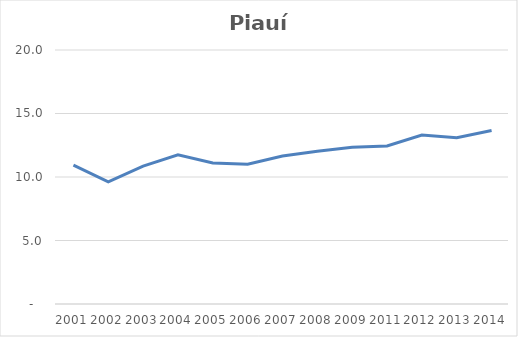
| Category | Total |
|---|---|
| 2001.0 | 10.928 |
| 2002.0 | 9.616 |
| 2003.0 | 10.854 |
| 2004.0 | 11.742 |
| 2005.0 | 11.096 |
| 2006.0 | 11.006 |
| 2007.0 | 11.653 |
| 2008.0 | 12.026 |
| 2009.0 | 12.334 |
| 2011.0 | 12.445 |
| 2012.0 | 13.3 |
| 2013.0 | 13.091 |
| 2014.0 | 13.662 |